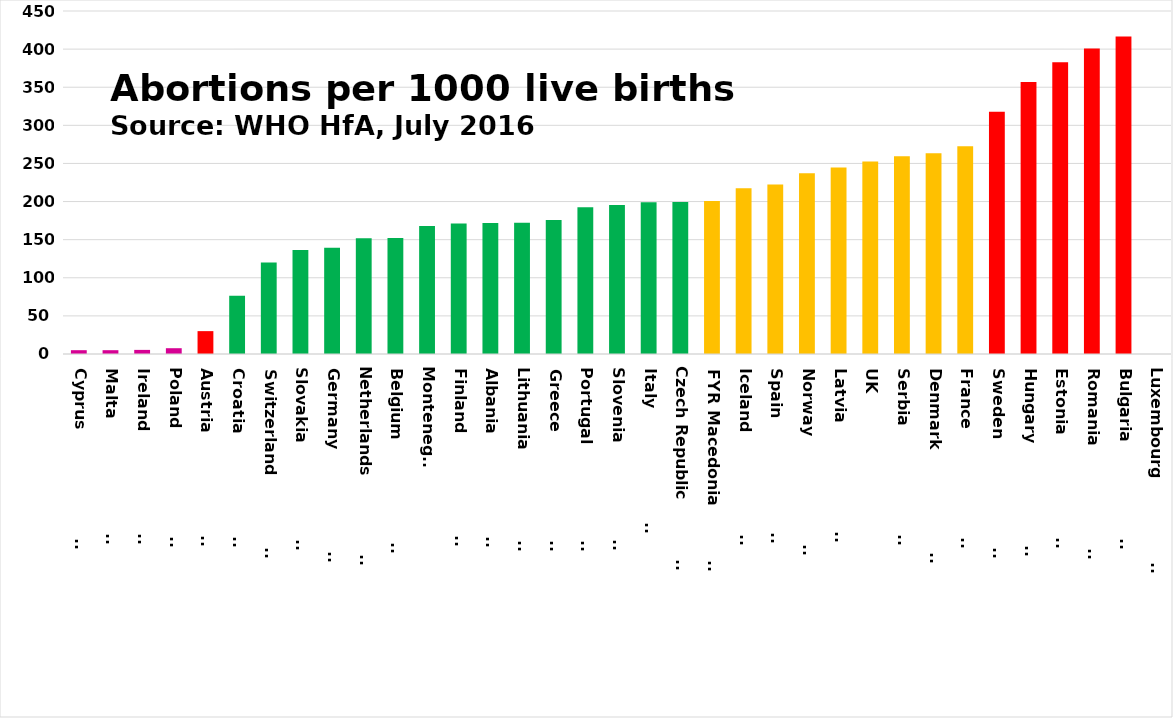
| Category | Series 0 |
|---|---|
| Cyprus                        | 5 |
| Malta                         | 5 |
| Ireland                       | 5.39 |
| Poland                        | 7.59 |
| Austria                       | 30 |
| Croatia                       | 76.33 |
| Switzerland                   | 120.17 |
| Slovakia                      | 136.3 |
| Germany                       | 139.48 |
| Netherlands                   | 151.83 |
| Belgium                       | 152.12 |
| Montenegro | 167.88 |
| Finland                       | 171.18 |
| Albania                       | 171.76 |
| Lithuania                     | 172.25 |
| Greece                        | 175.67 |
| Portugal                      | 192.44 |
| Slovenia                      | 195.49 |
| Italy                         | 199.17 |
| Czech Republic                | 199.28 |
| FYR Macedonia                | 200.8 |
| Iceland                       | 217.37 |
| Spain                         | 222.49 |
| Norway                        | 237.07 |
| Latvia                        | 244.55 |
| UK | 252.54 |
| Serbia                        | 259.37 |
| Denmark                       | 263.33 |
| France                        | 272.65 |
| Sweden                        | 317.85 |
| Hungary                       | 356.93 |
| Estonia                       | 382.85 |
| Romania                       | 400.65 |
| Bulgaria                      | 416.44 |
| Luxembourg                    | 0 |